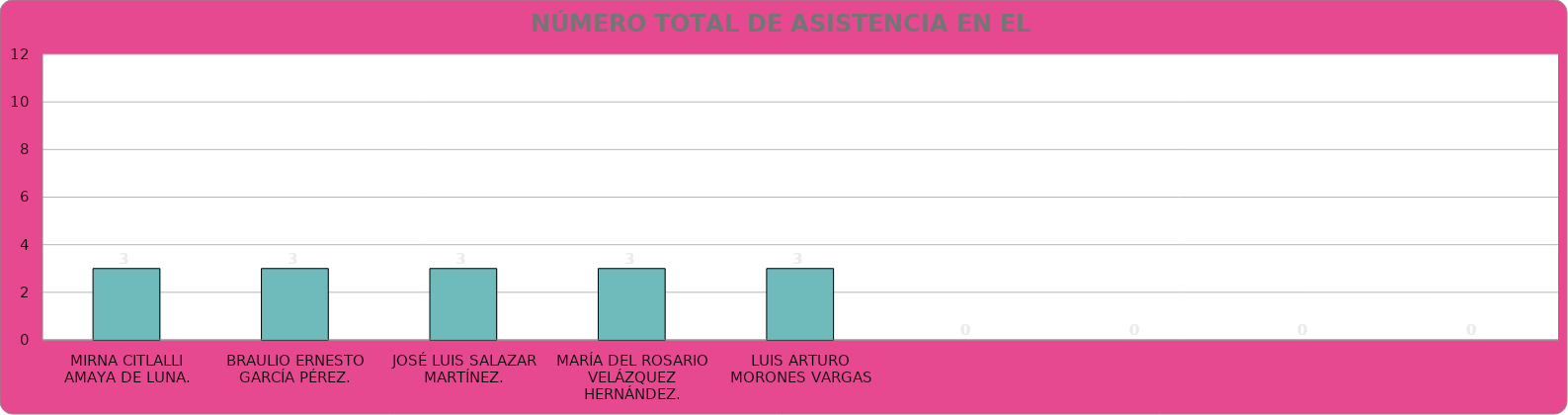
| Category | NOMBRE NOMBRE NOMBRE NOMBRE NOMBRE NOMBRE NOMBRE NOMBRE NOMBRE |
|---|---|
| MIRNA CITLALLI AMAYA DE LUNA. | 3 |
| BRAULIO ERNESTO GARCÍA PÉREZ. | 3 |
| JOSÉ LUIS SALAZAR MARTÍNEZ. | 3 |
| MARÍA DEL ROSARIO VELÁZQUEZ HERNÁNDEZ. | 3 |
| LUIS ARTURO MORONES VARGAS | 3 |